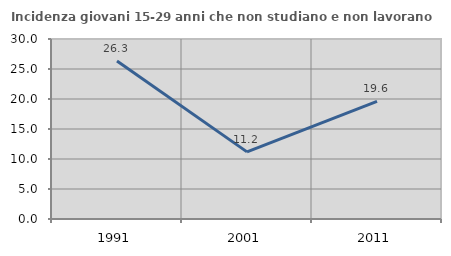
| Category | Incidenza giovani 15-29 anni che non studiano e non lavorano  |
|---|---|
| 1991.0 | 26.323 |
| 2001.0 | 11.189 |
| 2011.0 | 19.6 |